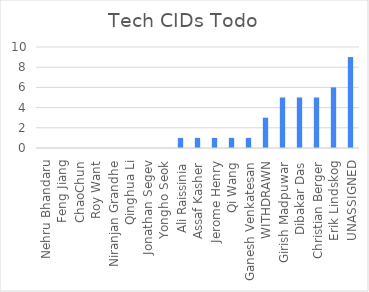
| Category | Series 0 |
|---|---|
| Nehru Bhandaru | 0 |
| Feng Jiang | 0 |
| ChaoChun | 0 |
| Roy Want | 0 |
| Niranjan Grandhe | 0 |
| Qinghua Li | 0 |
| Jonathan Segev | 0 |
| Yongho Seok | 0 |
| Ali Raissinia | 1 |
| Assaf Kasher | 1 |
| Jerome Henry | 1 |
| Qi Wang | 1 |
| Ganesh Venkatesan | 1 |
| WITHDRAWN | 3 |
| Girish Madpuwar | 5 |
| Dibakar Das | 5 |
| Christian Berger | 5 |
| Erik Lindskog | 6 |
| UNASSIGNED | 9 |